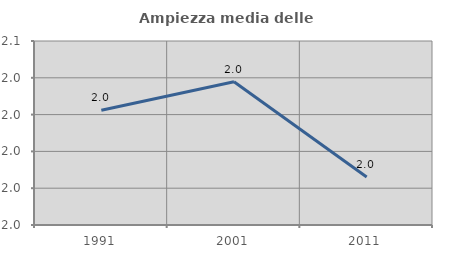
| Category | Ampiezza media delle famiglie |
|---|---|
| 1991.0 | 2.022 |
| 2001.0 | 2.038 |
| 2011.0 | 1.986 |